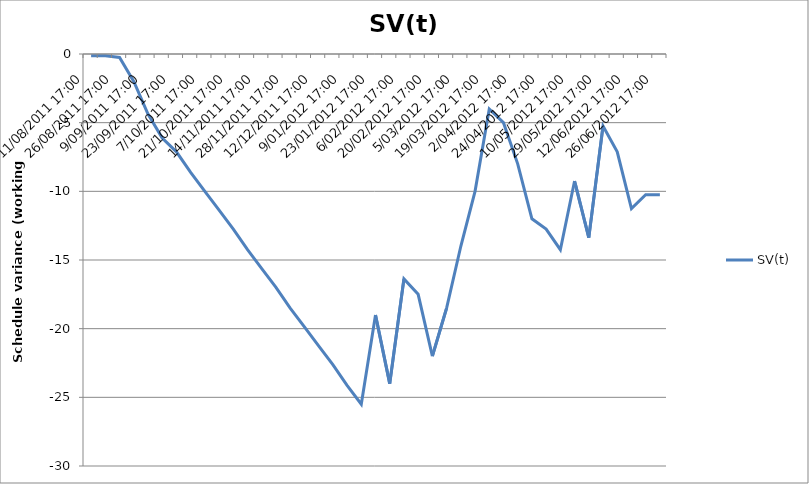
| Category | SV(t) |
|---|---|
| 11/08/2011 17:00 | -0.125 |
| 19/08/2011 17:00 | -0.125 |
| 26/08/2011 17:00 | -0.25 |
| 2/09/2011 17:00 | -2 |
| 9/09/2011 17:00 | -4.375 |
| 16/09/2011 17:00 | -6.125 |
| 23/09/2011 17:00 | -7.125 |
| 30/09/2011 17:00 | -8.625 |
| 7/10/2011 17:00 | -10 |
| 14/10/2011 17:00 | -11.375 |
| 21/10/2011 17:00 | -12.75 |
| 28/10/2011 17:00 | -14.25 |
| 14/11/2011 17:00 | -15.625 |
| 21/11/2011 17:00 | -17 |
| 28/11/2011 17:00 | -18.5 |
| 5/12/2011 17:00 | -19.875 |
| 12/12/2011 17:00 | -21.25 |
| 19/12/2011 17:00 | -22.625 |
| 9/01/2012 17:00 | -24.125 |
| 16/01/2012 17:00 | -25.5 |
| 23/01/2012 17:00 | -19 |
| 30/01/2012 17:00 | -24 |
| 6/02/2012 17:00 | -16.375 |
| 13/02/2012 17:00 | -17.5 |
| 20/02/2012 17:00 | -22 |
| 27/02/2012 17:00 | -18.5 |
| 5/03/2012 17:00 | -14 |
| 12/03/2012 17:00 | -10 |
| 19/03/2012 17:00 | -4 |
| 26/03/2012 17:00 | -5 |
| 2/04/2012 17:00 | -8 |
| 17/04/2012 17:00 | -12 |
| 24/04/2012 17:00 | -12.75 |
| 3/05/2012 17:00 | -14.25 |
| 10/05/2012 17:00 | -9.25 |
| 21/05/2012 17:00 | -13.375 |
| 29/05/2012 17:00 | -5.25 |
| 5/06/2012 17:00 | -7.125 |
| 12/06/2012 17:00 | -11.25 |
| 19/06/2012 17:00 | -10.25 |
| 26/06/2012 17:00 | -10.25 |